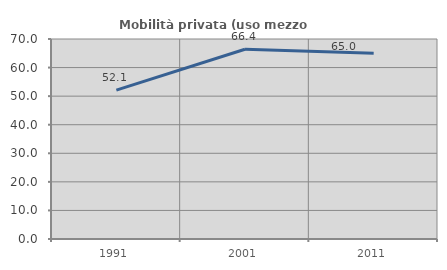
| Category | Mobilità privata (uso mezzo privato) |
|---|---|
| 1991.0 | 52.098 |
| 2001.0 | 66.409 |
| 2011.0 | 65.039 |